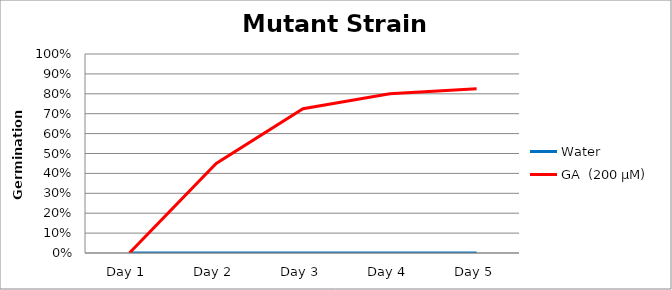
| Category | Water | GA  (200 µM)  |
|---|---|---|
| Day 1 | 0 | 0 |
| Day 2 | 0 | 0.45 |
| Day 3 | 0 | 0.725 |
| Day 4 | 0 | 0.8 |
| Day 5 | 0 | 0.825 |